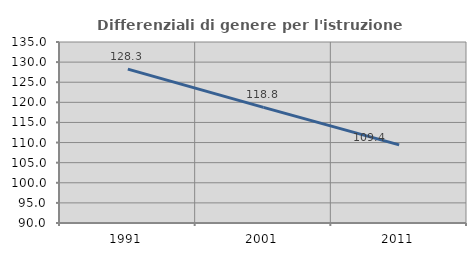
| Category | Differenziali di genere per l'istruzione superiore |
|---|---|
| 1991.0 | 128.257 |
| 2001.0 | 118.75 |
| 2011.0 | 109.417 |